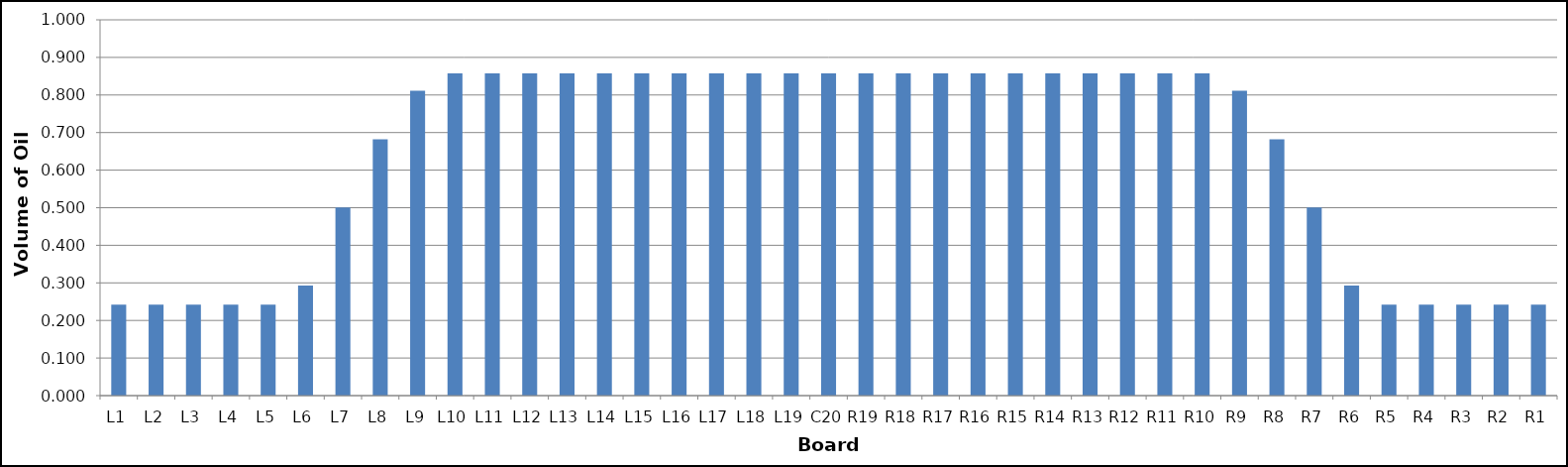
| Category | Series 0 |
|---|---|
| L1 | 0.242 |
| L2 | 0.242 |
| L3 | 0.242 |
| L4 | 0.242 |
| L5 | 0.242 |
| L6 | 0.293 |
| L7 | 0.5 |
| L8 | 0.682 |
| L9 | 0.811 |
| L10 | 0.858 |
| L11 | 0.858 |
| L12 | 0.858 |
| L13 | 0.858 |
| L14 | 0.858 |
| L15 | 0.858 |
| L16 | 0.858 |
| L17 | 0.858 |
| L18 | 0.858 |
| L19 | 0.858 |
| C20 | 0.858 |
| R19 | 0.858 |
| R18 | 0.858 |
| R17 | 0.858 |
| R16 | 0.858 |
| R15 | 0.858 |
| R14 | 0.858 |
| R13 | 0.858 |
| R12 | 0.858 |
| R11 | 0.858 |
| R10 | 0.858 |
| R9 | 0.811 |
| R8 | 0.682 |
| R7 | 0.5 |
| R6 | 0.293 |
| R5 | 0.242 |
| R4 | 0.242 |
| R3 | 0.242 |
| R2 | 0.242 |
| R1 | 0.242 |